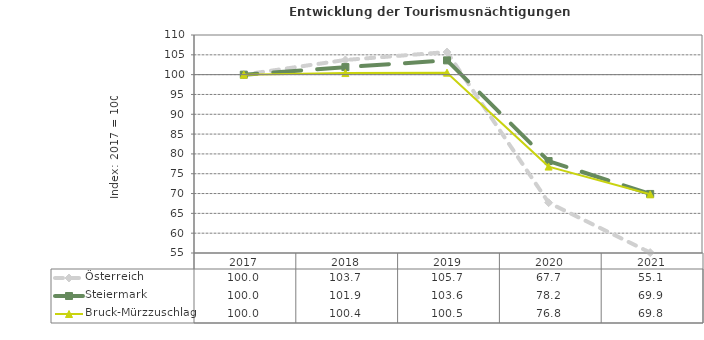
| Category | Österreich | Steiermark | Bruck-Mürzzuschlag |
|---|---|---|---|
| 2021.0 | 55.1 | 69.9 | 69.8 |
| 2020.0 | 67.7 | 78.2 | 76.8 |
| 2019.0 | 105.7 | 103.6 | 100.5 |
| 2018.0 | 103.7 | 101.9 | 100.4 |
| 2017.0 | 100 | 100 | 100 |